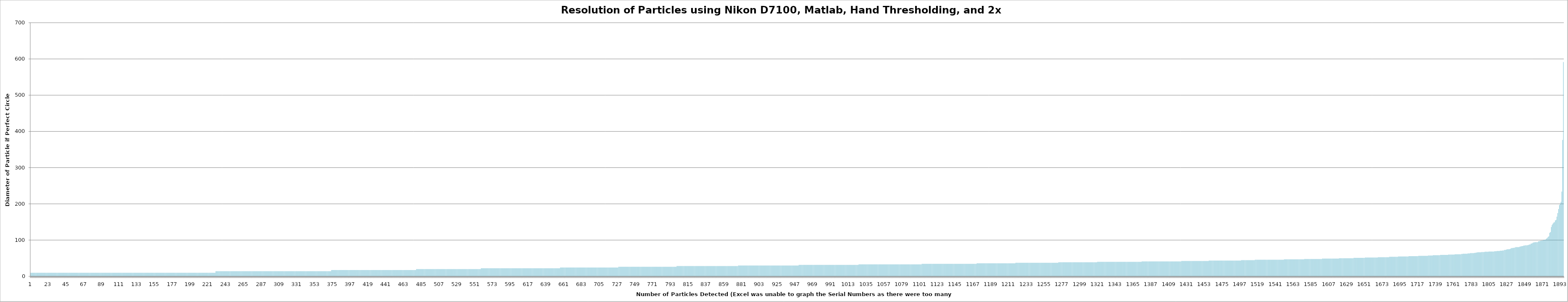
| Category | Matlab Diameter if Perfect Circle (um) |
|---|---|
| 0 | 10.007 |
| 1 | 10.007 |
| 2 | 10.007 |
| 3 | 10.007 |
| 4 | 10.007 |
| 5 | 10.007 |
| 6 | 10.007 |
| 7 | 10.007 |
| 8 | 10.007 |
| 9 | 10.007 |
| 10 | 10.007 |
| 11 | 10.007 |
| 12 | 10.007 |
| 13 | 10.007 |
| 14 | 10.007 |
| 15 | 10.007 |
| 16 | 10.007 |
| 17 | 10.007 |
| 18 | 10.007 |
| 19 | 10.007 |
| 20 | 10.007 |
| 21 | 10.007 |
| 22 | 10.007 |
| 23 | 10.007 |
| 24 | 10.007 |
| 25 | 10.007 |
| 26 | 10.007 |
| 27 | 10.007 |
| 28 | 10.007 |
| 29 | 10.007 |
| 30 | 10.007 |
| 31 | 10.007 |
| 32 | 10.007 |
| 33 | 10.007 |
| 34 | 10.007 |
| 35 | 10.007 |
| 36 | 10.007 |
| 37 | 10.007 |
| 38 | 10.007 |
| 39 | 10.007 |
| 40 | 10.007 |
| 41 | 10.007 |
| 42 | 10.007 |
| 43 | 10.007 |
| 44 | 10.007 |
| 45 | 10.007 |
| 46 | 10.007 |
| 47 | 10.007 |
| 48 | 10.007 |
| 49 | 10.007 |
| 50 | 10.007 |
| 51 | 10.007 |
| 52 | 10.007 |
| 53 | 10.007 |
| 54 | 10.007 |
| 55 | 10.007 |
| 56 | 10.007 |
| 57 | 10.007 |
| 58 | 10.007 |
| 59 | 10.007 |
| 60 | 10.007 |
| 61 | 10.007 |
| 62 | 10.007 |
| 63 | 10.007 |
| 64 | 10.007 |
| 65 | 10.007 |
| 66 | 10.007 |
| 67 | 10.007 |
| 68 | 10.007 |
| 69 | 10.007 |
| 70 | 10.007 |
| 71 | 10.007 |
| 72 | 10.007 |
| 73 | 10.007 |
| 74 | 10.007 |
| 75 | 10.007 |
| 76 | 10.007 |
| 77 | 10.007 |
| 78 | 10.007 |
| 79 | 10.007 |
| 80 | 10.007 |
| 81 | 10.007 |
| 82 | 10.007 |
| 83 | 10.007 |
| 84 | 10.007 |
| 85 | 10.007 |
| 86 | 10.007 |
| 87 | 10.007 |
| 88 | 10.007 |
| 89 | 10.007 |
| 90 | 10.007 |
| 91 | 10.007 |
| 92 | 10.007 |
| 93 | 10.007 |
| 94 | 10.007 |
| 95 | 10.007 |
| 96 | 10.007 |
| 97 | 10.007 |
| 98 | 10.007 |
| 99 | 10.007 |
| 100 | 10.007 |
| 101 | 10.007 |
| 102 | 10.007 |
| 103 | 10.007 |
| 104 | 10.007 |
| 105 | 10.007 |
| 106 | 10.007 |
| 107 | 10.007 |
| 108 | 10.007 |
| 109 | 10.007 |
| 110 | 10.007 |
| 111 | 10.007 |
| 112 | 10.007 |
| 113 | 10.007 |
| 114 | 10.007 |
| 115 | 10.007 |
| 116 | 10.007 |
| 117 | 10.007 |
| 118 | 10.007 |
| 119 | 10.007 |
| 120 | 10.007 |
| 121 | 10.007 |
| 122 | 10.007 |
| 123 | 10.007 |
| 124 | 10.007 |
| 125 | 10.007 |
| 126 | 10.007 |
| 127 | 10.007 |
| 128 | 10.007 |
| 129 | 10.007 |
| 130 | 10.007 |
| 131 | 10.007 |
| 132 | 10.007 |
| 133 | 10.007 |
| 134 | 10.007 |
| 135 | 10.007 |
| 136 | 10.007 |
| 137 | 10.007 |
| 138 | 10.007 |
| 139 | 10.007 |
| 140 | 10.007 |
| 141 | 10.007 |
| 142 | 10.007 |
| 143 | 10.007 |
| 144 | 10.007 |
| 145 | 10.007 |
| 146 | 10.007 |
| 147 | 10.007 |
| 148 | 10.007 |
| 149 | 10.007 |
| 150 | 10.007 |
| 151 | 10.007 |
| 152 | 10.007 |
| 153 | 10.007 |
| 154 | 10.007 |
| 155 | 10.007 |
| 156 | 10.007 |
| 157 | 10.007 |
| 158 | 10.007 |
| 159 | 10.007 |
| 160 | 10.007 |
| 161 | 10.007 |
| 162 | 10.007 |
| 163 | 10.007 |
| 164 | 10.007 |
| 165 | 10.007 |
| 166 | 10.007 |
| 167 | 10.007 |
| 168 | 10.007 |
| 169 | 10.007 |
| 170 | 10.007 |
| 171 | 10.007 |
| 172 | 10.007 |
| 173 | 10.007 |
| 174 | 10.007 |
| 175 | 10.007 |
| 176 | 10.007 |
| 177 | 10.007 |
| 178 | 10.007 |
| 179 | 10.007 |
| 180 | 10.007 |
| 181 | 10.007 |
| 182 | 10.007 |
| 183 | 10.007 |
| 184 | 10.007 |
| 185 | 10.007 |
| 186 | 10.007 |
| 187 | 10.007 |
| 188 | 10.007 |
| 189 | 10.007 |
| 190 | 10.007 |
| 191 | 10.007 |
| 192 | 10.007 |
| 193 | 10.007 |
| 194 | 10.007 |
| 195 | 10.007 |
| 196 | 10.007 |
| 197 | 10.007 |
| 198 | 10.007 |
| 199 | 10.007 |
| 200 | 10.007 |
| 201 | 10.007 |
| 202 | 10.007 |
| 203 | 10.007 |
| 204 | 10.007 |
| 205 | 10.007 |
| 206 | 10.007 |
| 207 | 10.007 |
| 208 | 10.007 |
| 209 | 10.007 |
| 210 | 10.007 |
| 211 | 10.007 |
| 212 | 10.007 |
| 213 | 10.007 |
| 214 | 10.007 |
| 215 | 10.007 |
| 216 | 10.007 |
| 217 | 10.007 |
| 218 | 10.007 |
| 219 | 10.007 |
| 220 | 10.007 |
| 221 | 10.007 |
| 222 | 10.007 |
| 223 | 10.007 |
| 224 | 10.007 |
| 225 | 10.007 |
| 226 | 10.007 |
| 227 | 10.007 |
| 228 | 10.007 |
| 229 | 14.152 |
| 230 | 14.152 |
| 231 | 14.152 |
| 232 | 14.152 |
| 233 | 14.152 |
| 234 | 14.152 |
| 235 | 14.152 |
| 236 | 14.152 |
| 237 | 14.152 |
| 238 | 14.152 |
| 239 | 14.152 |
| 240 | 14.152 |
| 241 | 14.152 |
| 242 | 14.152 |
| 243 | 14.152 |
| 244 | 14.152 |
| 245 | 14.152 |
| 246 | 14.152 |
| 247 | 14.152 |
| 248 | 14.152 |
| 249 | 14.152 |
| 250 | 14.152 |
| 251 | 14.152 |
| 252 | 14.152 |
| 253 | 14.152 |
| 254 | 14.152 |
| 255 | 14.152 |
| 256 | 14.152 |
| 257 | 14.152 |
| 258 | 14.152 |
| 259 | 14.152 |
| 260 | 14.152 |
| 261 | 14.152 |
| 262 | 14.152 |
| 263 | 14.152 |
| 264 | 14.152 |
| 265 | 14.152 |
| 266 | 14.152 |
| 267 | 14.152 |
| 268 | 14.152 |
| 269 | 14.152 |
| 270 | 14.152 |
| 271 | 14.152 |
| 272 | 14.152 |
| 273 | 14.152 |
| 274 | 14.152 |
| 275 | 14.152 |
| 276 | 14.152 |
| 277 | 14.152 |
| 278 | 14.152 |
| 279 | 14.152 |
| 280 | 14.152 |
| 281 | 14.152 |
| 282 | 14.152 |
| 283 | 14.152 |
| 284 | 14.152 |
| 285 | 14.152 |
| 286 | 14.152 |
| 287 | 14.152 |
| 288 | 14.152 |
| 289 | 14.152 |
| 290 | 14.152 |
| 291 | 14.152 |
| 292 | 14.152 |
| 293 | 14.152 |
| 294 | 14.152 |
| 295 | 14.152 |
| 296 | 14.152 |
| 297 | 14.152 |
| 298 | 14.152 |
| 299 | 14.152 |
| 300 | 14.152 |
| 301 | 14.152 |
| 302 | 14.152 |
| 303 | 14.152 |
| 304 | 14.152 |
| 305 | 14.152 |
| 306 | 14.152 |
| 307 | 14.152 |
| 308 | 14.152 |
| 309 | 14.152 |
| 310 | 14.152 |
| 311 | 14.152 |
| 312 | 14.152 |
| 313 | 14.152 |
| 314 | 14.152 |
| 315 | 14.152 |
| 316 | 14.152 |
| 317 | 14.152 |
| 318 | 14.152 |
| 319 | 14.152 |
| 320 | 14.152 |
| 321 | 14.152 |
| 322 | 14.152 |
| 323 | 14.152 |
| 324 | 14.152 |
| 325 | 14.152 |
| 326 | 14.152 |
| 327 | 14.152 |
| 328 | 14.152 |
| 329 | 14.152 |
| 330 | 14.152 |
| 331 | 14.152 |
| 332 | 14.152 |
| 333 | 14.152 |
| 334 | 14.152 |
| 335 | 14.152 |
| 336 | 14.152 |
| 337 | 14.152 |
| 338 | 14.152 |
| 339 | 14.152 |
| 340 | 14.152 |
| 341 | 14.152 |
| 342 | 14.152 |
| 343 | 14.152 |
| 344 | 14.152 |
| 345 | 14.152 |
| 346 | 14.152 |
| 347 | 14.152 |
| 348 | 14.152 |
| 349 | 14.152 |
| 350 | 14.152 |
| 351 | 14.152 |
| 352 | 14.152 |
| 353 | 14.152 |
| 354 | 14.152 |
| 355 | 14.152 |
| 356 | 14.152 |
| 357 | 14.152 |
| 358 | 14.152 |
| 359 | 14.152 |
| 360 | 14.152 |
| 361 | 14.152 |
| 362 | 14.152 |
| 363 | 14.152 |
| 364 | 14.152 |
| 365 | 14.152 |
| 366 | 14.152 |
| 367 | 14.152 |
| 368 | 14.152 |
| 369 | 14.152 |
| 370 | 14.152 |
| 371 | 14.152 |
| 372 | 17.332 |
| 373 | 17.332 |
| 374 | 17.332 |
| 375 | 17.332 |
| 376 | 17.332 |
| 377 | 17.332 |
| 378 | 17.332 |
| 379 | 17.332 |
| 380 | 17.332 |
| 381 | 17.332 |
| 382 | 17.332 |
| 383 | 17.332 |
| 384 | 17.332 |
| 385 | 17.332 |
| 386 | 17.332 |
| 387 | 17.332 |
| 388 | 17.332 |
| 389 | 17.332 |
| 390 | 17.332 |
| 391 | 17.332 |
| 392 | 17.332 |
| 393 | 17.332 |
| 394 | 17.332 |
| 395 | 17.332 |
| 396 | 17.332 |
| 397 | 17.332 |
| 398 | 17.332 |
| 399 | 17.332 |
| 400 | 17.332 |
| 401 | 17.332 |
| 402 | 17.332 |
| 403 | 17.332 |
| 404 | 17.332 |
| 405 | 17.332 |
| 406 | 17.332 |
| 407 | 17.332 |
| 408 | 17.332 |
| 409 | 17.332 |
| 410 | 17.332 |
| 411 | 17.332 |
| 412 | 17.332 |
| 413 | 17.332 |
| 414 | 17.332 |
| 415 | 17.332 |
| 416 | 17.332 |
| 417 | 17.332 |
| 418 | 17.332 |
| 419 | 17.332 |
| 420 | 17.332 |
| 421 | 17.332 |
| 422 | 17.332 |
| 423 | 17.332 |
| 424 | 17.332 |
| 425 | 17.332 |
| 426 | 17.332 |
| 427 | 17.332 |
| 428 | 17.332 |
| 429 | 17.332 |
| 430 | 17.332 |
| 431 | 17.332 |
| 432 | 17.332 |
| 433 | 17.332 |
| 434 | 17.332 |
| 435 | 17.332 |
| 436 | 17.332 |
| 437 | 17.332 |
| 438 | 17.332 |
| 439 | 17.332 |
| 440 | 17.332 |
| 441 | 17.332 |
| 442 | 17.332 |
| 443 | 17.332 |
| 444 | 17.332 |
| 445 | 17.332 |
| 446 | 17.332 |
| 447 | 17.332 |
| 448 | 17.332 |
| 449 | 17.332 |
| 450 | 17.332 |
| 451 | 17.332 |
| 452 | 17.332 |
| 453 | 17.332 |
| 454 | 17.332 |
| 455 | 17.332 |
| 456 | 17.332 |
| 457 | 17.332 |
| 458 | 17.332 |
| 459 | 17.332 |
| 460 | 17.332 |
| 461 | 17.332 |
| 462 | 17.332 |
| 463 | 17.332 |
| 464 | 17.332 |
| 465 | 17.332 |
| 466 | 17.332 |
| 467 | 17.332 |
| 468 | 17.332 |
| 469 | 17.332 |
| 470 | 17.332 |
| 471 | 17.332 |
| 472 | 17.332 |
| 473 | 17.332 |
| 474 | 17.332 |
| 475 | 17.332 |
| 476 | 17.332 |
| 477 | 20.013 |
| 478 | 20.013 |
| 479 | 20.013 |
| 480 | 20.013 |
| 481 | 20.013 |
| 482 | 20.013 |
| 483 | 20.013 |
| 484 | 20.013 |
| 485 | 20.013 |
| 486 | 20.013 |
| 487 | 20.013 |
| 488 | 20.013 |
| 489 | 20.013 |
| 490 | 20.013 |
| 491 | 20.013 |
| 492 | 20.013 |
| 493 | 20.013 |
| 494 | 20.013 |
| 495 | 20.013 |
| 496 | 20.013 |
| 497 | 20.013 |
| 498 | 20.013 |
| 499 | 20.013 |
| 500 | 20.013 |
| 501 | 20.013 |
| 502 | 20.013 |
| 503 | 20.013 |
| 504 | 20.013 |
| 505 | 20.013 |
| 506 | 20.013 |
| 507 | 20.013 |
| 508 | 20.013 |
| 509 | 20.013 |
| 510 | 20.013 |
| 511 | 20.013 |
| 512 | 20.013 |
| 513 | 20.013 |
| 514 | 20.013 |
| 515 | 20.013 |
| 516 | 20.013 |
| 517 | 20.013 |
| 518 | 20.013 |
| 519 | 20.013 |
| 520 | 20.013 |
| 521 | 20.013 |
| 522 | 20.013 |
| 523 | 20.013 |
| 524 | 20.013 |
| 525 | 20.013 |
| 526 | 20.013 |
| 527 | 20.013 |
| 528 | 20.013 |
| 529 | 20.013 |
| 530 | 20.013 |
| 531 | 20.013 |
| 532 | 20.013 |
| 533 | 20.013 |
| 534 | 20.013 |
| 535 | 20.013 |
| 536 | 20.013 |
| 537 | 20.013 |
| 538 | 20.013 |
| 539 | 20.013 |
| 540 | 20.013 |
| 541 | 20.013 |
| 542 | 20.013 |
| 543 | 20.013 |
| 544 | 20.013 |
| 545 | 20.013 |
| 546 | 20.013 |
| 547 | 20.013 |
| 548 | 20.013 |
| 549 | 20.013 |
| 550 | 20.013 |
| 551 | 20.013 |
| 552 | 20.013 |
| 553 | 20.013 |
| 554 | 20.013 |
| 555 | 20.013 |
| 556 | 20.013 |
| 557 | 22.376 |
| 558 | 22.376 |
| 559 | 22.376 |
| 560 | 22.376 |
| 561 | 22.376 |
| 562 | 22.376 |
| 563 | 22.376 |
| 564 | 22.376 |
| 565 | 22.376 |
| 566 | 22.376 |
| 567 | 22.376 |
| 568 | 22.376 |
| 569 | 22.376 |
| 570 | 22.376 |
| 571 | 22.376 |
| 572 | 22.376 |
| 573 | 22.376 |
| 574 | 22.376 |
| 575 | 22.376 |
| 576 | 22.376 |
| 577 | 22.376 |
| 578 | 22.376 |
| 579 | 22.376 |
| 580 | 22.376 |
| 581 | 22.376 |
| 582 | 22.376 |
| 583 | 22.376 |
| 584 | 22.376 |
| 585 | 22.376 |
| 586 | 22.376 |
| 587 | 22.376 |
| 588 | 22.376 |
| 589 | 22.376 |
| 590 | 22.376 |
| 591 | 22.376 |
| 592 | 22.376 |
| 593 | 22.376 |
| 594 | 22.376 |
| 595 | 22.376 |
| 596 | 22.376 |
| 597 | 22.376 |
| 598 | 22.376 |
| 599 | 22.376 |
| 600 | 22.376 |
| 601 | 22.376 |
| 602 | 22.376 |
| 603 | 22.376 |
| 604 | 22.376 |
| 605 | 22.376 |
| 606 | 22.376 |
| 607 | 22.376 |
| 608 | 22.376 |
| 609 | 22.376 |
| 610 | 22.376 |
| 611 | 22.376 |
| 612 | 22.376 |
| 613 | 22.376 |
| 614 | 22.376 |
| 615 | 22.376 |
| 616 | 22.376 |
| 617 | 22.376 |
| 618 | 22.376 |
| 619 | 22.376 |
| 620 | 22.376 |
| 621 | 22.376 |
| 622 | 22.376 |
| 623 | 22.376 |
| 624 | 22.376 |
| 625 | 22.376 |
| 626 | 22.376 |
| 627 | 22.376 |
| 628 | 22.376 |
| 629 | 22.376 |
| 630 | 22.376 |
| 631 | 22.376 |
| 632 | 22.376 |
| 633 | 22.376 |
| 634 | 22.376 |
| 635 | 22.376 |
| 636 | 22.376 |
| 637 | 22.376 |
| 638 | 22.376 |
| 639 | 22.376 |
| 640 | 22.376 |
| 641 | 22.376 |
| 642 | 22.376 |
| 643 | 22.376 |
| 644 | 22.376 |
| 645 | 22.376 |
| 646 | 22.376 |
| 647 | 22.376 |
| 648 | 22.376 |
| 649 | 22.376 |
| 650 | 22.376 |
| 651 | 22.376 |
| 652 | 22.376 |
| 653 | 22.376 |
| 654 | 22.376 |
| 655 | 24.511 |
| 656 | 24.511 |
| 657 | 24.511 |
| 658 | 24.511 |
| 659 | 24.511 |
| 660 | 24.511 |
| 661 | 24.511 |
| 662 | 24.511 |
| 663 | 24.511 |
| 664 | 24.511 |
| 665 | 24.511 |
| 666 | 24.511 |
| 667 | 24.511 |
| 668 | 24.511 |
| 669 | 24.511 |
| 670 | 24.511 |
| 671 | 24.511 |
| 672 | 24.511 |
| 673 | 24.511 |
| 674 | 24.511 |
| 675 | 24.511 |
| 676 | 24.511 |
| 677 | 24.511 |
| 678 | 24.511 |
| 679 | 24.511 |
| 680 | 24.511 |
| 681 | 24.511 |
| 682 | 24.511 |
| 683 | 24.511 |
| 684 | 24.511 |
| 685 | 24.511 |
| 686 | 24.511 |
| 687 | 24.511 |
| 688 | 24.511 |
| 689 | 24.511 |
| 690 | 24.511 |
| 691 | 24.511 |
| 692 | 24.511 |
| 693 | 24.511 |
| 694 | 24.511 |
| 695 | 24.511 |
| 696 | 24.511 |
| 697 | 24.511 |
| 698 | 24.511 |
| 699 | 24.511 |
| 700 | 24.511 |
| 701 | 24.511 |
| 702 | 24.511 |
| 703 | 24.511 |
| 704 | 24.511 |
| 705 | 24.511 |
| 706 | 24.511 |
| 707 | 24.511 |
| 708 | 24.511 |
| 709 | 24.511 |
| 710 | 24.511 |
| 711 | 24.511 |
| 712 | 24.511 |
| 713 | 24.511 |
| 714 | 24.511 |
| 715 | 24.511 |
| 716 | 24.511 |
| 717 | 24.511 |
| 718 | 24.511 |
| 719 | 24.511 |
| 720 | 24.511 |
| 721 | 24.511 |
| 722 | 24.511 |
| 723 | 24.511 |
| 724 | 24.511 |
| 725 | 24.511 |
| 726 | 24.511 |
| 727 | 26.475 |
| 728 | 26.475 |
| 729 | 26.475 |
| 730 | 26.475 |
| 731 | 26.475 |
| 732 | 26.475 |
| 733 | 26.475 |
| 734 | 26.475 |
| 735 | 26.475 |
| 736 | 26.475 |
| 737 | 26.475 |
| 738 | 26.475 |
| 739 | 26.475 |
| 740 | 26.475 |
| 741 | 26.475 |
| 742 | 26.475 |
| 743 | 26.475 |
| 744 | 26.475 |
| 745 | 26.475 |
| 746 | 26.475 |
| 747 | 26.475 |
| 748 | 26.475 |
| 749 | 26.475 |
| 750 | 26.475 |
| 751 | 26.475 |
| 752 | 26.475 |
| 753 | 26.475 |
| 754 | 26.475 |
| 755 | 26.475 |
| 756 | 26.475 |
| 757 | 26.475 |
| 758 | 26.475 |
| 759 | 26.475 |
| 760 | 26.475 |
| 761 | 26.475 |
| 762 | 26.475 |
| 763 | 26.475 |
| 764 | 26.475 |
| 765 | 26.475 |
| 766 | 26.475 |
| 767 | 26.475 |
| 768 | 26.475 |
| 769 | 26.475 |
| 770 | 26.475 |
| 771 | 26.475 |
| 772 | 26.475 |
| 773 | 26.475 |
| 774 | 26.475 |
| 775 | 26.475 |
| 776 | 26.475 |
| 777 | 26.475 |
| 778 | 26.475 |
| 779 | 26.475 |
| 780 | 26.475 |
| 781 | 26.475 |
| 782 | 26.475 |
| 783 | 26.475 |
| 784 | 26.475 |
| 785 | 26.475 |
| 786 | 26.475 |
| 787 | 26.475 |
| 788 | 26.475 |
| 789 | 26.475 |
| 790 | 26.475 |
| 791 | 26.475 |
| 792 | 26.475 |
| 793 | 26.475 |
| 794 | 26.475 |
| 795 | 26.475 |
| 796 | 26.475 |
| 797 | 26.475 |
| 798 | 26.475 |
| 799 | 28.303 |
| 800 | 28.303 |
| 801 | 28.303 |
| 802 | 28.303 |
| 803 | 28.303 |
| 804 | 28.303 |
| 805 | 28.303 |
| 806 | 28.303 |
| 807 | 28.303 |
| 808 | 28.303 |
| 809 | 28.303 |
| 810 | 28.303 |
| 811 | 28.303 |
| 812 | 28.303 |
| 813 | 28.303 |
| 814 | 28.303 |
| 815 | 28.303 |
| 816 | 28.303 |
| 817 | 28.303 |
| 818 | 28.303 |
| 819 | 28.303 |
| 820 | 28.303 |
| 821 | 28.303 |
| 822 | 28.303 |
| 823 | 28.303 |
| 824 | 28.303 |
| 825 | 28.303 |
| 826 | 28.303 |
| 827 | 28.303 |
| 828 | 28.303 |
| 829 | 28.303 |
| 830 | 28.303 |
| 831 | 28.303 |
| 832 | 28.303 |
| 833 | 28.303 |
| 834 | 28.303 |
| 835 | 28.303 |
| 836 | 28.303 |
| 837 | 28.303 |
| 838 | 28.303 |
| 839 | 28.303 |
| 840 | 28.303 |
| 841 | 28.303 |
| 842 | 28.303 |
| 843 | 28.303 |
| 844 | 28.303 |
| 845 | 28.303 |
| 846 | 28.303 |
| 847 | 28.303 |
| 848 | 28.303 |
| 849 | 28.303 |
| 850 | 28.303 |
| 851 | 28.303 |
| 852 | 28.303 |
| 853 | 28.303 |
| 854 | 28.303 |
| 855 | 28.303 |
| 856 | 28.303 |
| 857 | 28.303 |
| 858 | 28.303 |
| 859 | 28.303 |
| 860 | 28.303 |
| 861 | 28.303 |
| 862 | 28.303 |
| 863 | 28.303 |
| 864 | 28.303 |
| 865 | 28.303 |
| 866 | 28.303 |
| 867 | 28.303 |
| 868 | 28.303 |
| 869 | 28.303 |
| 870 | 28.303 |
| 871 | 28.303 |
| 872 | 28.303 |
| 873 | 28.303 |
| 874 | 28.303 |
| 875 | 30.02 |
| 876 | 30.02 |
| 877 | 30.02 |
| 878 | 30.02 |
| 879 | 30.02 |
| 880 | 30.02 |
| 881 | 30.02 |
| 882 | 30.02 |
| 883 | 30.02 |
| 884 | 30.02 |
| 885 | 30.02 |
| 886 | 30.02 |
| 887 | 30.02 |
| 888 | 30.02 |
| 889 | 30.02 |
| 890 | 30.02 |
| 891 | 30.02 |
| 892 | 30.02 |
| 893 | 30.02 |
| 894 | 30.02 |
| 895 | 30.02 |
| 896 | 30.02 |
| 897 | 30.02 |
| 898 | 30.02 |
| 899 | 30.02 |
| 900 | 30.02 |
| 901 | 30.02 |
| 902 | 30.02 |
| 903 | 30.02 |
| 904 | 30.02 |
| 905 | 30.02 |
| 906 | 30.02 |
| 907 | 30.02 |
| 908 | 30.02 |
| 909 | 30.02 |
| 910 | 30.02 |
| 911 | 30.02 |
| 912 | 30.02 |
| 913 | 30.02 |
| 914 | 30.02 |
| 915 | 30.02 |
| 916 | 30.02 |
| 917 | 30.02 |
| 918 | 30.02 |
| 919 | 30.02 |
| 920 | 30.02 |
| 921 | 30.02 |
| 922 | 30.02 |
| 923 | 30.02 |
| 924 | 30.02 |
| 925 | 30.02 |
| 926 | 30.02 |
| 927 | 30.02 |
| 928 | 30.02 |
| 929 | 30.02 |
| 930 | 30.02 |
| 931 | 30.02 |
| 932 | 30.02 |
| 933 | 30.02 |
| 934 | 30.02 |
| 935 | 30.02 |
| 936 | 30.02 |
| 937 | 30.02 |
| 938 | 30.02 |
| 939 | 30.02 |
| 940 | 30.02 |
| 941 | 30.02 |
| 942 | 30.02 |
| 943 | 30.02 |
| 944 | 30.02 |
| 945 | 30.02 |
| 946 | 30.02 |
| 947 | 30.02 |
| 948 | 30.02 |
| 949 | 30.02 |
| 950 | 31.644 |
| 951 | 31.644 |
| 952 | 31.644 |
| 953 | 31.644 |
| 954 | 31.644 |
| 955 | 31.644 |
| 956 | 31.644 |
| 957 | 31.644 |
| 958 | 31.644 |
| 959 | 31.644 |
| 960 | 31.644 |
| 961 | 31.644 |
| 962 | 31.644 |
| 963 | 31.644 |
| 964 | 31.644 |
| 965 | 31.644 |
| 966 | 31.644 |
| 967 | 31.644 |
| 968 | 31.644 |
| 969 | 31.644 |
| 970 | 31.644 |
| 971 | 31.644 |
| 972 | 31.644 |
| 973 | 31.644 |
| 974 | 31.644 |
| 975 | 31.644 |
| 976 | 31.644 |
| 977 | 31.644 |
| 978 | 31.644 |
| 979 | 31.644 |
| 980 | 31.644 |
| 981 | 31.644 |
| 982 | 31.644 |
| 983 | 31.644 |
| 984 | 31.644 |
| 985 | 31.644 |
| 986 | 31.644 |
| 987 | 31.644 |
| 988 | 31.644 |
| 989 | 31.644 |
| 990 | 31.644 |
| 991 | 31.644 |
| 992 | 31.644 |
| 993 | 31.644 |
| 994 | 31.644 |
| 995 | 31.644 |
| 996 | 31.644 |
| 997 | 31.644 |
| 998 | 31.644 |
| 999 | 31.644 |
| 1000 | 31.644 |
| 1001 | 31.644 |
| 1002 | 31.644 |
| 1003 | 31.644 |
| 1004 | 31.644 |
| 1005 | 31.644 |
| 1006 | 31.644 |
| 1007 | 31.644 |
| 1008 | 31.644 |
| 1009 | 31.644 |
| 1010 | 31.644 |
| 1011 | 31.644 |
| 1012 | 31.644 |
| 1013 | 31.644 |
| 1014 | 31.644 |
| 1015 | 31.644 |
| 1016 | 31.644 |
| 1017 | 31.644 |
| 1018 | 31.644 |
| 1019 | 31.644 |
| 1020 | 31.644 |
| 1021 | 31.644 |
| 1022 | 31.644 |
| 1023 | 31.644 |
| 1024 | 33.188 |
| 1025 | 33.188 |
| 1026 | 33.188 |
| 1027 | 33.188 |
| 1028 | 33.188 |
| 1029 | 33.188 |
| 1030 | 33.188 |
| 1031 | 33.188 |
| 1032 | 33.188 |
| 1033 | 33.188 |
| 1034 | 33.188 |
| 1035 | 33.188 |
| 1036 | 33.188 |
| 1037 | 33.188 |
| 1038 | 33.188 |
| 1039 | 33.188 |
| 1040 | 33.188 |
| 1041 | 33.188 |
| 1042 | 33.188 |
| 1043 | 33.188 |
| 1044 | 33.188 |
| 1045 | 33.188 |
| 1046 | 33.188 |
| 1047 | 33.188 |
| 1048 | 33.188 |
| 1049 | 33.188 |
| 1050 | 33.188 |
| 1051 | 33.188 |
| 1052 | 33.188 |
| 1053 | 33.188 |
| 1054 | 33.188 |
| 1055 | 33.188 |
| 1056 | 33.188 |
| 1057 | 33.188 |
| 1058 | 33.188 |
| 1059 | 33.188 |
| 1060 | 33.188 |
| 1061 | 33.188 |
| 1062 | 33.188 |
| 1063 | 33.188 |
| 1064 | 33.188 |
| 1065 | 33.188 |
| 1066 | 33.188 |
| 1067 | 33.188 |
| 1068 | 33.188 |
| 1069 | 33.188 |
| 1070 | 33.188 |
| 1071 | 33.188 |
| 1072 | 33.188 |
| 1073 | 33.188 |
| 1074 | 33.188 |
| 1075 | 33.188 |
| 1076 | 33.188 |
| 1077 | 33.188 |
| 1078 | 33.188 |
| 1079 | 33.188 |
| 1080 | 33.188 |
| 1081 | 33.188 |
| 1082 | 33.188 |
| 1083 | 33.188 |
| 1084 | 33.188 |
| 1085 | 33.188 |
| 1086 | 33.188 |
| 1087 | 33.188 |
| 1088 | 33.188 |
| 1089 | 33.188 |
| 1090 | 33.188 |
| 1091 | 33.188 |
| 1092 | 33.188 |
| 1093 | 33.188 |
| 1094 | 33.188 |
| 1095 | 33.188 |
| 1096 | 33.188 |
| 1097 | 33.188 |
| 1098 | 33.188 |
| 1099 | 33.188 |
| 1100 | 33.188 |
| 1101 | 33.188 |
| 1102 | 34.664 |
| 1103 | 34.664 |
| 1104 | 34.664 |
| 1105 | 34.664 |
| 1106 | 34.664 |
| 1107 | 34.664 |
| 1108 | 34.664 |
| 1109 | 34.664 |
| 1110 | 34.664 |
| 1111 | 34.664 |
| 1112 | 34.664 |
| 1113 | 34.664 |
| 1114 | 34.664 |
| 1115 | 34.664 |
| 1116 | 34.664 |
| 1117 | 34.664 |
| 1118 | 34.664 |
| 1119 | 34.664 |
| 1120 | 34.664 |
| 1121 | 34.664 |
| 1122 | 34.664 |
| 1123 | 34.664 |
| 1124 | 34.664 |
| 1125 | 34.664 |
| 1126 | 34.664 |
| 1127 | 34.664 |
| 1128 | 34.664 |
| 1129 | 34.664 |
| 1130 | 34.664 |
| 1131 | 34.664 |
| 1132 | 34.664 |
| 1133 | 34.664 |
| 1134 | 34.664 |
| 1135 | 34.664 |
| 1136 | 34.664 |
| 1137 | 34.664 |
| 1138 | 34.664 |
| 1139 | 34.664 |
| 1140 | 34.664 |
| 1141 | 34.664 |
| 1142 | 34.664 |
| 1143 | 34.664 |
| 1144 | 34.664 |
| 1145 | 34.664 |
| 1146 | 34.664 |
| 1147 | 34.664 |
| 1148 | 34.664 |
| 1149 | 34.664 |
| 1150 | 34.664 |
| 1151 | 34.664 |
| 1152 | 34.664 |
| 1153 | 34.664 |
| 1154 | 34.664 |
| 1155 | 34.664 |
| 1156 | 34.664 |
| 1157 | 34.664 |
| 1158 | 34.664 |
| 1159 | 34.664 |
| 1160 | 34.664 |
| 1161 | 34.664 |
| 1162 | 34.664 |
| 1163 | 34.664 |
| 1164 | 34.664 |
| 1165 | 34.664 |
| 1166 | 34.664 |
| 1167 | 34.664 |
| 1168 | 34.664 |
| 1169 | 34.664 |
| 1170 | 36.08 |
| 1171 | 36.08 |
| 1172 | 36.08 |
| 1173 | 36.08 |
| 1174 | 36.08 |
| 1175 | 36.08 |
| 1176 | 36.08 |
| 1177 | 36.08 |
| 1178 | 36.08 |
| 1179 | 36.08 |
| 1180 | 36.08 |
| 1181 | 36.08 |
| 1182 | 36.08 |
| 1183 | 36.08 |
| 1184 | 36.08 |
| 1185 | 36.08 |
| 1186 | 36.08 |
| 1187 | 36.08 |
| 1188 | 36.08 |
| 1189 | 36.08 |
| 1190 | 36.08 |
| 1191 | 36.08 |
| 1192 | 36.08 |
| 1193 | 36.08 |
| 1194 | 36.08 |
| 1195 | 36.08 |
| 1196 | 36.08 |
| 1197 | 36.08 |
| 1198 | 36.08 |
| 1199 | 36.08 |
| 1200 | 36.08 |
| 1201 | 36.08 |
| 1202 | 36.08 |
| 1203 | 36.08 |
| 1204 | 36.08 |
| 1205 | 36.08 |
| 1206 | 36.08 |
| 1207 | 36.08 |
| 1208 | 36.08 |
| 1209 | 36.08 |
| 1210 | 36.08 |
| 1211 | 36.08 |
| 1212 | 36.08 |
| 1213 | 36.08 |
| 1214 | 36.08 |
| 1215 | 36.08 |
| 1216 | 36.08 |
| 1217 | 36.08 |
| 1218 | 37.442 |
| 1219 | 37.442 |
| 1220 | 37.442 |
| 1221 | 37.442 |
| 1222 | 37.442 |
| 1223 | 37.442 |
| 1224 | 37.442 |
| 1225 | 37.442 |
| 1226 | 37.442 |
| 1227 | 37.442 |
| 1228 | 37.442 |
| 1229 | 37.442 |
| 1230 | 37.442 |
| 1231 | 37.442 |
| 1232 | 37.442 |
| 1233 | 37.442 |
| 1234 | 37.442 |
| 1235 | 37.442 |
| 1236 | 37.442 |
| 1237 | 37.442 |
| 1238 | 37.442 |
| 1239 | 37.442 |
| 1240 | 37.442 |
| 1241 | 37.442 |
| 1242 | 37.442 |
| 1243 | 37.442 |
| 1244 | 37.442 |
| 1245 | 37.442 |
| 1246 | 37.442 |
| 1247 | 37.442 |
| 1248 | 37.442 |
| 1249 | 37.442 |
| 1250 | 37.442 |
| 1251 | 37.442 |
| 1252 | 37.442 |
| 1253 | 37.442 |
| 1254 | 37.442 |
| 1255 | 37.442 |
| 1256 | 37.442 |
| 1257 | 37.442 |
| 1258 | 37.442 |
| 1259 | 37.442 |
| 1260 | 37.442 |
| 1261 | 37.442 |
| 1262 | 37.442 |
| 1263 | 37.442 |
| 1264 | 37.442 |
| 1265 | 37.442 |
| 1266 | 37.442 |
| 1267 | 37.442 |
| 1268 | 37.442 |
| 1269 | 37.442 |
| 1270 | 37.442 |
| 1271 | 38.756 |
| 1272 | 38.756 |
| 1273 | 38.756 |
| 1274 | 38.756 |
| 1275 | 38.756 |
| 1276 | 38.756 |
| 1277 | 38.756 |
| 1278 | 38.756 |
| 1279 | 38.756 |
| 1280 | 38.756 |
| 1281 | 38.756 |
| 1282 | 38.756 |
| 1283 | 38.756 |
| 1284 | 38.756 |
| 1285 | 38.756 |
| 1286 | 38.756 |
| 1287 | 38.756 |
| 1288 | 38.756 |
| 1289 | 38.756 |
| 1290 | 38.756 |
| 1291 | 38.756 |
| 1292 | 38.756 |
| 1293 | 38.756 |
| 1294 | 38.756 |
| 1295 | 38.756 |
| 1296 | 38.756 |
| 1297 | 38.756 |
| 1298 | 38.756 |
| 1299 | 38.756 |
| 1300 | 38.756 |
| 1301 | 38.756 |
| 1302 | 38.756 |
| 1303 | 38.756 |
| 1304 | 38.756 |
| 1305 | 38.756 |
| 1306 | 38.756 |
| 1307 | 38.756 |
| 1308 | 38.756 |
| 1309 | 38.756 |
| 1310 | 38.756 |
| 1311 | 38.756 |
| 1312 | 38.756 |
| 1313 | 38.756 |
| 1314 | 38.756 |
| 1315 | 38.756 |
| 1316 | 38.756 |
| 1317 | 38.756 |
| 1318 | 38.756 |
| 1319 | 40.027 |
| 1320 | 40.027 |
| 1321 | 40.027 |
| 1322 | 40.027 |
| 1323 | 40.027 |
| 1324 | 40.027 |
| 1325 | 40.027 |
| 1326 | 40.027 |
| 1327 | 40.027 |
| 1328 | 40.027 |
| 1329 | 40.027 |
| 1330 | 40.027 |
| 1331 | 40.027 |
| 1332 | 40.027 |
| 1333 | 40.027 |
| 1334 | 40.027 |
| 1335 | 40.027 |
| 1336 | 40.027 |
| 1337 | 40.027 |
| 1338 | 40.027 |
| 1339 | 40.027 |
| 1340 | 40.027 |
| 1341 | 40.027 |
| 1342 | 40.027 |
| 1343 | 40.027 |
| 1344 | 40.027 |
| 1345 | 40.027 |
| 1346 | 40.027 |
| 1347 | 40.027 |
| 1348 | 40.027 |
| 1349 | 40.027 |
| 1350 | 40.027 |
| 1351 | 40.027 |
| 1352 | 40.027 |
| 1353 | 40.027 |
| 1354 | 40.027 |
| 1355 | 40.027 |
| 1356 | 40.027 |
| 1357 | 40.027 |
| 1358 | 40.027 |
| 1359 | 40.027 |
| 1360 | 40.027 |
| 1361 | 40.027 |
| 1362 | 40.027 |
| 1363 | 40.027 |
| 1364 | 40.027 |
| 1365 | 40.027 |
| 1366 | 40.027 |
| 1367 | 40.027 |
| 1368 | 40.027 |
| 1369 | 40.027 |
| 1370 | 40.027 |
| 1371 | 40.027 |
| 1372 | 40.027 |
| 1373 | 40.027 |
| 1374 | 41.259 |
| 1375 | 41.259 |
| 1376 | 41.259 |
| 1377 | 41.259 |
| 1378 | 41.259 |
| 1379 | 41.259 |
| 1380 | 41.259 |
| 1381 | 41.259 |
| 1382 | 41.259 |
| 1383 | 41.259 |
| 1384 | 41.259 |
| 1385 | 41.259 |
| 1386 | 41.259 |
| 1387 | 41.259 |
| 1388 | 41.259 |
| 1389 | 41.259 |
| 1390 | 41.259 |
| 1391 | 41.259 |
| 1392 | 41.259 |
| 1393 | 41.259 |
| 1394 | 41.259 |
| 1395 | 41.259 |
| 1396 | 41.259 |
| 1397 | 41.259 |
| 1398 | 41.259 |
| 1399 | 41.259 |
| 1400 | 41.259 |
| 1401 | 41.259 |
| 1402 | 41.259 |
| 1403 | 41.259 |
| 1404 | 41.259 |
| 1405 | 41.259 |
| 1406 | 41.259 |
| 1407 | 41.259 |
| 1408 | 41.259 |
| 1409 | 41.259 |
| 1410 | 41.259 |
| 1411 | 41.259 |
| 1412 | 41.259 |
| 1413 | 41.259 |
| 1414 | 41.259 |
| 1415 | 41.259 |
| 1416 | 41.259 |
| 1417 | 41.259 |
| 1418 | 41.259 |
| 1419 | 41.259 |
| 1420 | 41.259 |
| 1421 | 41.259 |
| 1422 | 41.259 |
| 1423 | 42.455 |
| 1424 | 42.455 |
| 1425 | 42.455 |
| 1426 | 42.455 |
| 1427 | 42.455 |
| 1428 | 42.455 |
| 1429 | 42.455 |
| 1430 | 42.455 |
| 1431 | 42.455 |
| 1432 | 42.455 |
| 1433 | 42.455 |
| 1434 | 42.455 |
| 1435 | 42.455 |
| 1436 | 42.455 |
| 1437 | 42.455 |
| 1438 | 42.455 |
| 1439 | 42.455 |
| 1440 | 42.455 |
| 1441 | 42.455 |
| 1442 | 42.455 |
| 1443 | 42.455 |
| 1444 | 42.455 |
| 1445 | 42.455 |
| 1446 | 42.455 |
| 1447 | 42.455 |
| 1448 | 42.455 |
| 1449 | 42.455 |
| 1450 | 42.455 |
| 1451 | 42.455 |
| 1452 | 42.455 |
| 1453 | 42.455 |
| 1454 | 42.455 |
| 1455 | 42.455 |
| 1456 | 42.455 |
| 1457 | 43.618 |
| 1458 | 43.618 |
| 1459 | 43.618 |
| 1460 | 43.618 |
| 1461 | 43.618 |
| 1462 | 43.618 |
| 1463 | 43.618 |
| 1464 | 43.618 |
| 1465 | 43.618 |
| 1466 | 43.618 |
| 1467 | 43.618 |
| 1468 | 43.618 |
| 1469 | 43.618 |
| 1470 | 43.618 |
| 1471 | 43.618 |
| 1472 | 43.618 |
| 1473 | 43.618 |
| 1474 | 43.618 |
| 1475 | 43.618 |
| 1476 | 43.618 |
| 1477 | 43.618 |
| 1478 | 43.618 |
| 1479 | 43.618 |
| 1480 | 43.618 |
| 1481 | 43.618 |
| 1482 | 43.618 |
| 1483 | 43.618 |
| 1484 | 43.618 |
| 1485 | 43.618 |
| 1486 | 43.618 |
| 1487 | 43.618 |
| 1488 | 43.618 |
| 1489 | 43.618 |
| 1490 | 43.618 |
| 1491 | 43.618 |
| 1492 | 43.618 |
| 1493 | 43.618 |
| 1494 | 43.618 |
| 1495 | 43.618 |
| 1496 | 43.618 |
| 1497 | 44.751 |
| 1498 | 44.751 |
| 1499 | 44.751 |
| 1500 | 44.751 |
| 1501 | 44.751 |
| 1502 | 44.751 |
| 1503 | 44.751 |
| 1504 | 44.751 |
| 1505 | 44.751 |
| 1506 | 44.751 |
| 1507 | 44.751 |
| 1508 | 44.751 |
| 1509 | 44.751 |
| 1510 | 44.751 |
| 1511 | 44.751 |
| 1512 | 44.751 |
| 1513 | 44.751 |
| 1514 | 45.856 |
| 1515 | 45.856 |
| 1516 | 45.856 |
| 1517 | 45.856 |
| 1518 | 45.856 |
| 1519 | 45.856 |
| 1520 | 45.856 |
| 1521 | 45.856 |
| 1522 | 45.856 |
| 1523 | 45.856 |
| 1524 | 45.856 |
| 1525 | 45.856 |
| 1526 | 45.856 |
| 1527 | 45.856 |
| 1528 | 45.856 |
| 1529 | 45.856 |
| 1530 | 45.856 |
| 1531 | 45.856 |
| 1532 | 45.856 |
| 1533 | 45.856 |
| 1534 | 45.856 |
| 1535 | 45.856 |
| 1536 | 45.856 |
| 1537 | 45.856 |
| 1538 | 45.856 |
| 1539 | 45.856 |
| 1540 | 45.856 |
| 1541 | 45.856 |
| 1542 | 45.856 |
| 1543 | 45.856 |
| 1544 | 45.856 |
| 1545 | 45.856 |
| 1546 | 45.856 |
| 1547 | 45.856 |
| 1548 | 45.856 |
| 1549 | 45.856 |
| 1550 | 46.936 |
| 1551 | 46.936 |
| 1552 | 46.936 |
| 1553 | 46.936 |
| 1554 | 46.936 |
| 1555 | 46.936 |
| 1556 | 46.936 |
| 1557 | 46.936 |
| 1558 | 46.936 |
| 1559 | 46.936 |
| 1560 | 46.936 |
| 1561 | 46.936 |
| 1562 | 46.936 |
| 1563 | 46.936 |
| 1564 | 46.936 |
| 1565 | 46.936 |
| 1566 | 46.936 |
| 1567 | 46.936 |
| 1568 | 46.936 |
| 1569 | 46.936 |
| 1570 | 46.936 |
| 1571 | 46.936 |
| 1572 | 46.936 |
| 1573 | 46.936 |
| 1574 | 46.936 |
| 1575 | 47.99 |
| 1576 | 47.99 |
| 1577 | 47.99 |
| 1578 | 47.99 |
| 1579 | 47.99 |
| 1580 | 47.99 |
| 1581 | 47.99 |
| 1582 | 47.99 |
| 1583 | 47.99 |
| 1584 | 47.99 |
| 1585 | 47.99 |
| 1586 | 47.99 |
| 1587 | 47.99 |
| 1588 | 47.99 |
| 1589 | 47.99 |
| 1590 | 47.99 |
| 1591 | 47.99 |
| 1592 | 47.99 |
| 1593 | 47.99 |
| 1594 | 47.99 |
| 1595 | 47.99 |
| 1596 | 47.99 |
| 1597 | 49.023 |
| 1598 | 49.023 |
| 1599 | 49.023 |
| 1600 | 49.023 |
| 1601 | 49.023 |
| 1602 | 49.023 |
| 1603 | 49.023 |
| 1604 | 49.023 |
| 1605 | 49.023 |
| 1606 | 49.023 |
| 1607 | 49.023 |
| 1608 | 49.023 |
| 1609 | 49.023 |
| 1610 | 49.023 |
| 1611 | 49.023 |
| 1612 | 49.023 |
| 1613 | 49.023 |
| 1614 | 49.023 |
| 1615 | 49.023 |
| 1616 | 49.023 |
| 1617 | 49.023 |
| 1618 | 50.033 |
| 1619 | 50.033 |
| 1620 | 50.033 |
| 1621 | 50.033 |
| 1622 | 50.033 |
| 1623 | 50.033 |
| 1624 | 50.033 |
| 1625 | 50.033 |
| 1626 | 50.033 |
| 1627 | 50.033 |
| 1628 | 50.033 |
| 1629 | 50.033 |
| 1630 | 50.033 |
| 1631 | 50.033 |
| 1632 | 50.033 |
| 1633 | 50.033 |
| 1634 | 50.033 |
| 1635 | 50.033 |
| 1636 | 51.024 |
| 1637 | 51.024 |
| 1638 | 51.024 |
| 1639 | 51.024 |
| 1640 | 51.024 |
| 1641 | 51.024 |
| 1642 | 51.024 |
| 1643 | 51.024 |
| 1644 | 51.024 |
| 1645 | 51.024 |
| 1646 | 51.024 |
| 1647 | 51.024 |
| 1648 | 51.024 |
| 1649 | 51.024 |
| 1650 | 51.996 |
| 1651 | 51.996 |
| 1652 | 51.996 |
| 1653 | 51.996 |
| 1654 | 51.996 |
| 1655 | 51.996 |
| 1656 | 51.996 |
| 1657 | 51.996 |
| 1658 | 51.996 |
| 1659 | 51.996 |
| 1660 | 51.996 |
| 1661 | 51.996 |
| 1662 | 51.996 |
| 1663 | 51.996 |
| 1664 | 51.996 |
| 1665 | 51.996 |
| 1666 | 52.95 |
| 1667 | 52.95 |
| 1668 | 52.95 |
| 1669 | 52.95 |
| 1670 | 52.95 |
| 1671 | 52.95 |
| 1672 | 52.95 |
| 1673 | 52.95 |
| 1674 | 52.95 |
| 1675 | 52.95 |
| 1676 | 52.95 |
| 1677 | 52.95 |
| 1678 | 52.95 |
| 1679 | 52.95 |
| 1680 | 53.888 |
| 1681 | 53.888 |
| 1682 | 53.888 |
| 1683 | 53.888 |
| 1684 | 53.888 |
| 1685 | 53.888 |
| 1686 | 53.888 |
| 1687 | 53.888 |
| 1688 | 53.888 |
| 1689 | 53.888 |
| 1690 | 53.888 |
| 1691 | 54.809 |
| 1692 | 54.809 |
| 1693 | 54.809 |
| 1694 | 54.809 |
| 1695 | 54.809 |
| 1696 | 54.809 |
| 1697 | 54.809 |
| 1698 | 54.809 |
| 1699 | 54.809 |
| 1700 | 54.809 |
| 1701 | 54.809 |
| 1702 | 54.809 |
| 1703 | 54.809 |
| 1704 | 55.715 |
| 1705 | 55.715 |
| 1706 | 55.715 |
| 1707 | 55.715 |
| 1708 | 55.715 |
| 1709 | 55.715 |
| 1710 | 55.715 |
| 1711 | 55.715 |
| 1712 | 55.715 |
| 1713 | 55.715 |
| 1714 | 55.715 |
| 1715 | 55.715 |
| 1716 | 56.606 |
| 1717 | 56.606 |
| 1718 | 56.606 |
| 1719 | 56.606 |
| 1720 | 56.606 |
| 1721 | 56.606 |
| 1722 | 56.606 |
| 1723 | 56.606 |
| 1724 | 56.606 |
| 1725 | 56.606 |
| 1726 | 56.606 |
| 1727 | 56.606 |
| 1728 | 57.484 |
| 1729 | 57.484 |
| 1730 | 57.484 |
| 1731 | 57.484 |
| 1732 | 57.484 |
| 1733 | 57.484 |
| 1734 | 58.349 |
| 1735 | 58.349 |
| 1736 | 58.349 |
| 1737 | 58.349 |
| 1738 | 58.349 |
| 1739 | 58.349 |
| 1740 | 58.349 |
| 1741 | 58.349 |
| 1742 | 58.349 |
| 1743 | 59.2 |
| 1744 | 59.2 |
| 1745 | 59.2 |
| 1746 | 59.2 |
| 1747 | 59.2 |
| 1748 | 59.2 |
| 1749 | 59.2 |
| 1750 | 59.2 |
| 1751 | 59.2 |
| 1752 | 59.2 |
| 1753 | 60.04 |
| 1754 | 60.04 |
| 1755 | 60.04 |
| 1756 | 60.04 |
| 1757 | 60.04 |
| 1758 | 60.04 |
| 1759 | 60.04 |
| 1760 | 60.04 |
| 1761 | 60.868 |
| 1762 | 60.868 |
| 1763 | 60.868 |
| 1764 | 60.868 |
| 1765 | 60.868 |
| 1766 | 60.868 |
| 1767 | 60.868 |
| 1768 | 60.868 |
| 1769 | 61.685 |
| 1770 | 61.685 |
| 1771 | 62.492 |
| 1772 | 62.492 |
| 1773 | 62.492 |
| 1774 | 62.492 |
| 1775 | 62.492 |
| 1776 | 62.492 |
| 1777 | 63.288 |
| 1778 | 63.288 |
| 1779 | 63.288 |
| 1780 | 64.074 |
| 1781 | 64.074 |
| 1782 | 64.074 |
| 1783 | 64.074 |
| 1784 | 64.074 |
| 1785 | 64.851 |
| 1786 | 64.851 |
| 1787 | 65.618 |
| 1788 | 65.618 |
| 1789 | 66.377 |
| 1790 | 66.377 |
| 1791 | 66.377 |
| 1792 | 66.377 |
| 1793 | 66.377 |
| 1794 | 67.127 |
| 1795 | 67.127 |
| 1796 | 67.127 |
| 1797 | 67.127 |
| 1798 | 67.869 |
| 1799 | 67.869 |
| 1800 | 67.869 |
| 1801 | 67.869 |
| 1802 | 67.869 |
| 1803 | 68.602 |
| 1804 | 68.602 |
| 1805 | 68.602 |
| 1806 | 68.602 |
| 1807 | 68.602 |
| 1808 | 68.602 |
| 1809 | 68.602 |
| 1810 | 69.328 |
| 1811 | 69.328 |
| 1812 | 69.328 |
| 1813 | 70.047 |
| 1814 | 70.047 |
| 1815 | 70.047 |
| 1816 | 70.047 |
| 1817 | 70.758 |
| 1818 | 70.758 |
| 1819 | 70.758 |
| 1820 | 71.462 |
| 1821 | 71.462 |
| 1822 | 72.85 |
| 1823 | 72.85 |
| 1824 | 73.534 |
| 1825 | 74.212 |
| 1826 | 74.883 |
| 1827 | 74.883 |
| 1828 | 74.883 |
| 1829 | 75.549 |
| 1830 | 76.863 |
| 1831 | 78.155 |
| 1832 | 78.155 |
| 1833 | 78.793 |
| 1834 | 78.793 |
| 1835 | 79.426 |
| 1836 | 80.676 |
| 1837 | 80.676 |
| 1838 | 80.676 |
| 1839 | 80.676 |
| 1840 | 80.676 |
| 1841 | 81.908 |
| 1842 | 82.517 |
| 1843 | 83.122 |
| 1844 | 83.722 |
| 1845 | 83.722 |
| 1846 | 84.91 |
| 1847 | 84.91 |
| 1848 | 85.497 |
| 1849 | 85.497 |
| 1850 | 85.497 |
| 1851 | 86.081 |
| 1852 | 86.66 |
| 1853 | 87.808 |
| 1854 | 87.808 |
| 1855 | 90.614 |
| 1856 | 90.614 |
| 1857 | 92.257 |
| 1858 | 93.336 |
| 1859 | 93.871 |
| 1860 | 94.403 |
| 1861 | 94.403 |
| 1862 | 94.403 |
| 1863 | 94.403 |
| 1864 | 96.501 |
| 1865 | 96.501 |
| 1866 | 98.045 |
| 1867 | 98.045 |
| 1868 | 99.061 |
| 1869 | 99.061 |
| 1870 | 100.067 |
| 1871 | 100.566 |
| 1872 | 101.063 |
| 1873 | 101.557 |
| 1874 | 103.993 |
| 1875 | 105.901 |
| 1876 | 108.7 |
| 1877 | 110.527 |
| 1878 | 120.08 |
| 1879 | 122.147 |
| 1880 | 136.106 |
| 1881 | 141.869 |
| 1882 | 145.356 |
| 1883 | 148.423 |
| 1884 | 149.432 |
| 1885 | 154.376 |
| 1886 | 155.989 |
| 1887 | 164.731 |
| 1888 | 174.759 |
| 1889 | 185.596 |
| 1890 | 196.855 |
| 1891 | 200.883 |
| 1892 | 205.807 |
| 1893 | 233.823 |
| 1894 | 376.549 |
| 1895 | 591.327 |